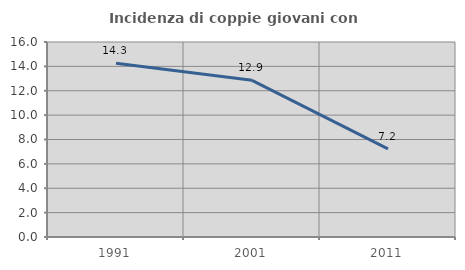
| Category | Incidenza di coppie giovani con figli |
|---|---|
| 1991.0 | 14.254 |
| 2001.0 | 12.857 |
| 2011.0 | 7.229 |